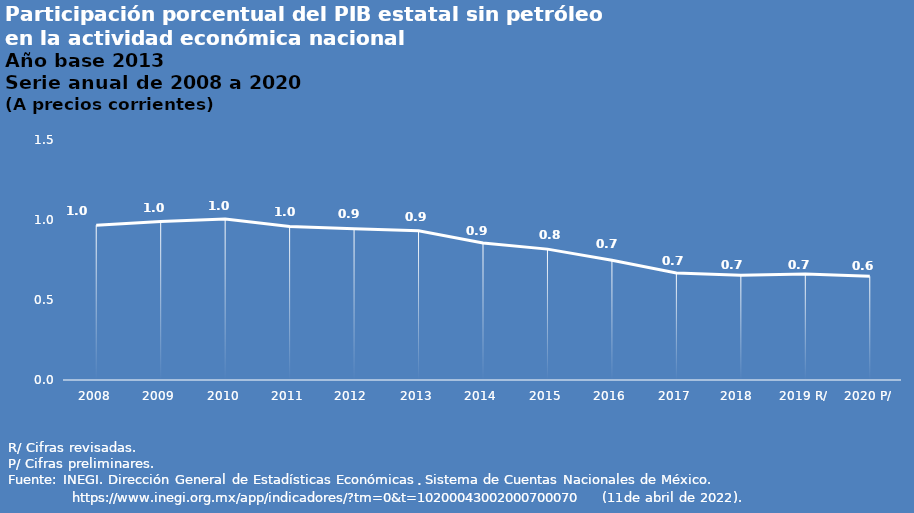
| Category | Series 0 |
|---|---|
| 2008 | 0.968 |
| 2009 | 0.991 |
| 2010 | 1.007 |
| 2011 | 0.96 |
| 2012  | 0.946 |
| 2013 | 0.933 |
| 2014 | 0.857 |
| 2015 | 0.818 |
| 2016 | 0.748 |
| 2017 | 0.669 |
| 2018  | 0.654 |
| 2019 R/ | 0.663 |
| 2020 P/ | 0.648 |